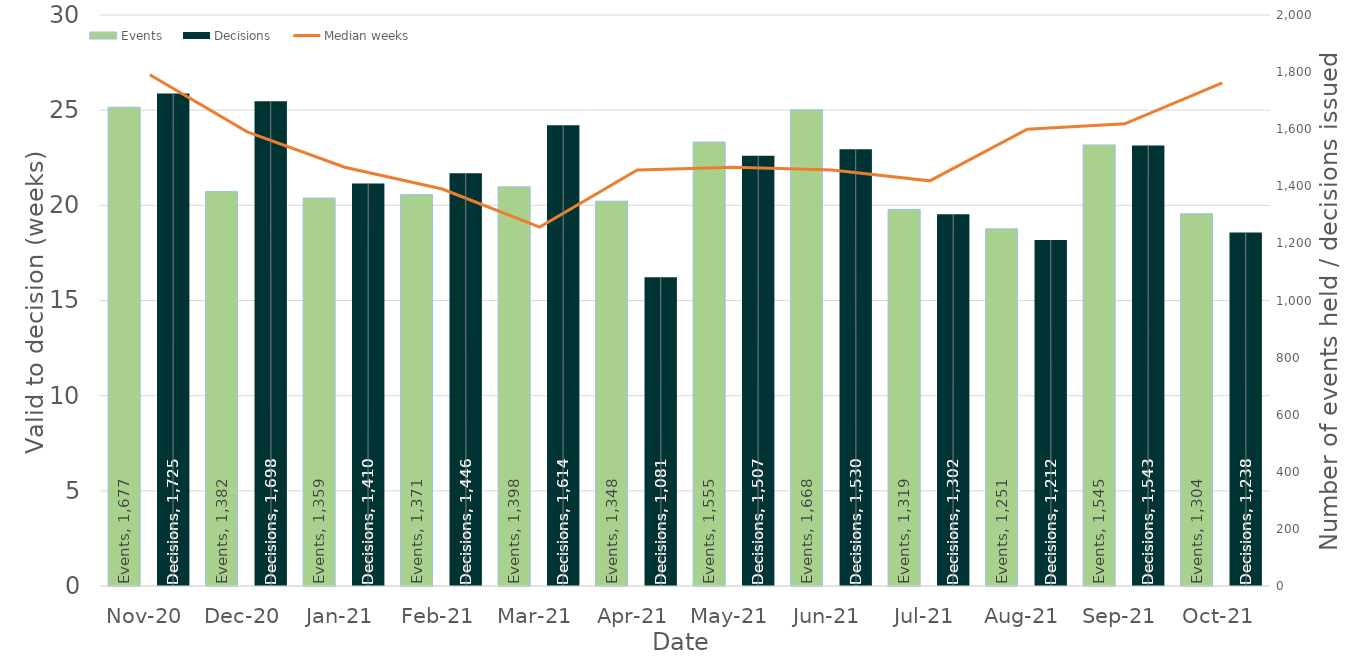
| Category | Events | Decisions |
|---|---|---|
| 0 | 1677 | 1725 |
| 1 | 1382 | 1698 |
| 2 | 1359 | 1410 |
| 3 | 1371 | 1446 |
| 4 | 1398 | 1614 |
| 5 | 1348 | 1081 |
| 6 | 1555 | 1507 |
| 7 | 1668 | 1530 |
| 8 | 1319 | 1302 |
| 9 | 1251 | 1212 |
| 10 | 1545 | 1543 |
| 11 | 1304 | 1238 |